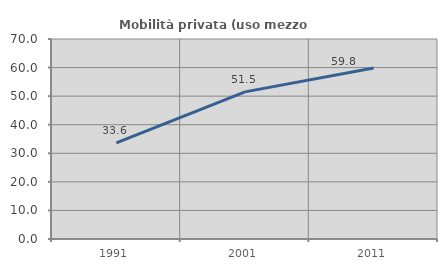
| Category | Mobilità privata (uso mezzo privato) |
|---|---|
| 1991.0 | 33.631 |
| 2001.0 | 51.485 |
| 2011.0 | 59.844 |